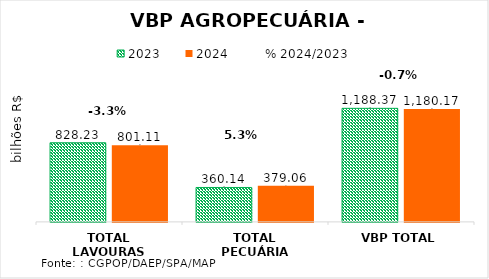
| Category | 2023 | 2024 |
|---|---|---|
| TOTAL LAVOURAS | 828.228 | 801.106 |
| TOTAL PECUÁRIA | 360.142 | 379.062 |
| VBP TOTAL | 1188.37 | 1180.168 |